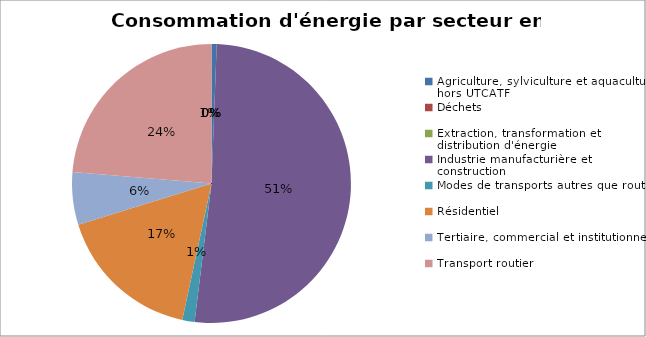
| Category | Series 0 |
|---|---|
| Agriculture, sylviculture et aquaculture hors UTCATF | 14315.304 |
| Déchets | 0 |
| Extraction, transformation et distribution d'énergie | 0 |
| Industrie manufacturière et construction | 1226659.313 |
| Modes de transports autres que routier | 34108.944 |
| Résidentiel | 402611.701 |
| Tertiaire, commercial et institutionnel | 145663.363 |
| Transport routier | 566075.928 |